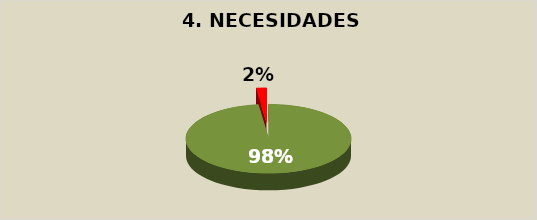
| Category | Series 0 |
|---|---|
| SI | 0.98 |
| NO | 0.02 |